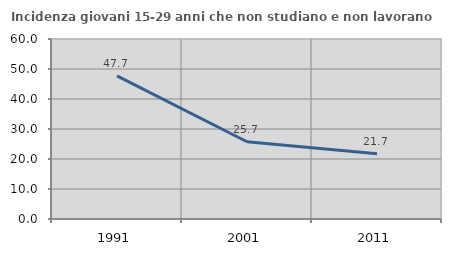
| Category | Incidenza giovani 15-29 anni che non studiano e non lavorano  |
|---|---|
| 1991.0 | 47.721 |
| 2001.0 | 25.743 |
| 2011.0 | 21.739 |